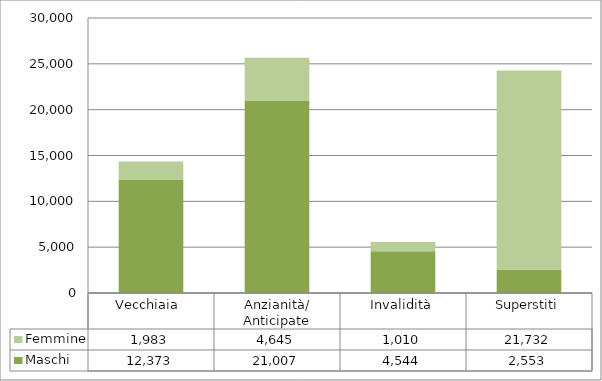
| Category | Maschi | Femmine |
|---|---|---|
| Vecchiaia  | 12373 | 1983 |
| Anzianità/ Anticipate | 21007 | 4645 |
| Invalidità | 4544 | 1010 |
| Superstiti | 2553 | 21732 |